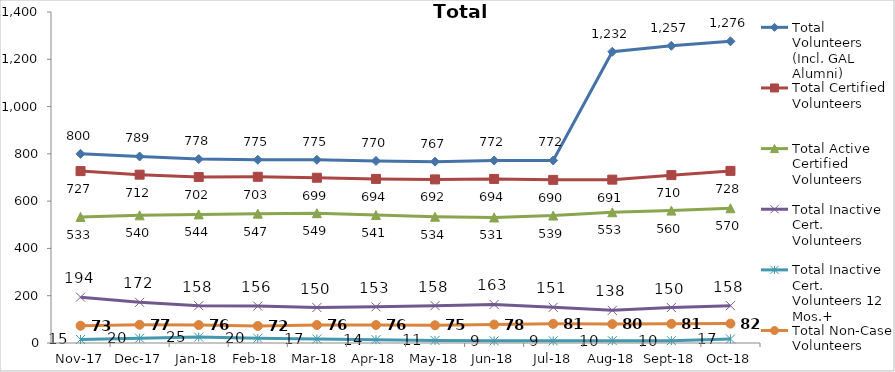
| Category | Total Volunteers (Incl. GAL Alumni) | Total Certified Volunteers | Total Active Certified Volunteers | Total Inactive Cert. Volunteers | Total Inactive Cert. Volunteers 12 Mos.+ | Total Non-Case Volunteers |
|---|---|---|---|---|---|---|
| 2017-11-01 | 800 | 727 | 533 | 194 | 15 | 73 |
| 2017-12-01 | 789 | 712 | 540 | 172 | 20 | 77 |
| 2018-01-01 | 778 | 702 | 544 | 158 | 25 | 76 |
| 2018-02-01 | 775 | 703 | 547 | 156 | 20 | 72 |
| 2018-03-01 | 775 | 699 | 549 | 150 | 17 | 76 |
| 2018-04-01 | 770 | 694 | 541 | 153 | 14 | 76 |
| 2018-05-01 | 767 | 692 | 534 | 158 | 11 | 75 |
| 2018-06-01 | 772 | 694 | 531 | 163 | 9 | 78 |
| 2018-07-01 | 772 | 690 | 539 | 151 | 9 | 81 |
| 2018-08-01 | 1232 | 691 | 553 | 138 | 10 | 80 |
| 2018-09-01 | 1257 | 710 | 560 | 150 | 10 | 81 |
| 2018-10-01 | 1276 | 728 | 570 | 158 | 17 | 82 |